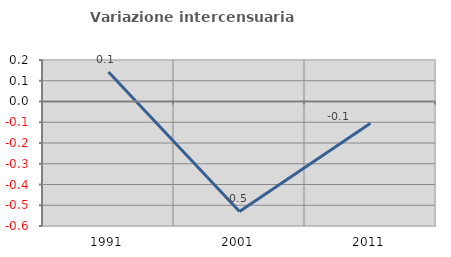
| Category | Variazione intercensuaria annua |
|---|---|
| 1991.0 | 0.142 |
| 2001.0 | -0.53 |
| 2011.0 | -0.105 |